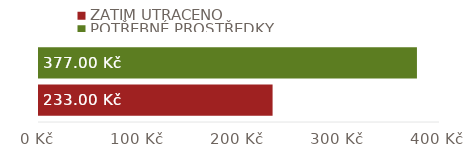
| Category | ZATÍM UTRACENO | POTŘEBNÉ PROSTŘEDKY |
|---|---|---|
| SOUČTY | 233 | 377 |